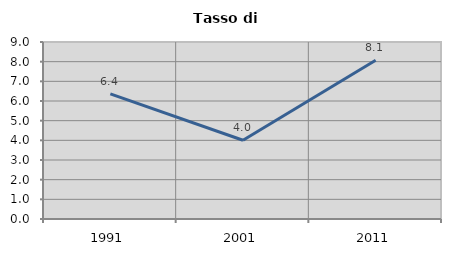
| Category | Tasso di disoccupazione   |
|---|---|
| 1991.0 | 6.364 |
| 2001.0 | 4.004 |
| 2011.0 | 8.069 |